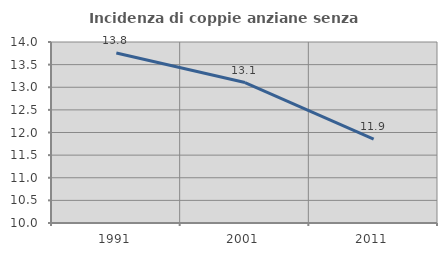
| Category | Incidenza di coppie anziane senza figli  |
|---|---|
| 1991.0 | 13.757 |
| 2001.0 | 13.103 |
| 2011.0 | 11.852 |